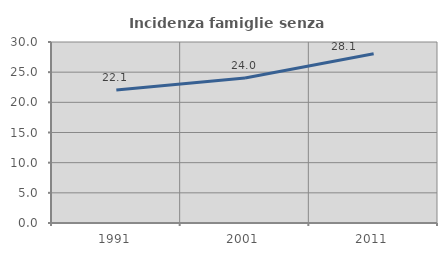
| Category | Incidenza famiglie senza nuclei |
|---|---|
| 1991.0 | 22.056 |
| 2001.0 | 24.039 |
| 2011.0 | 28.061 |